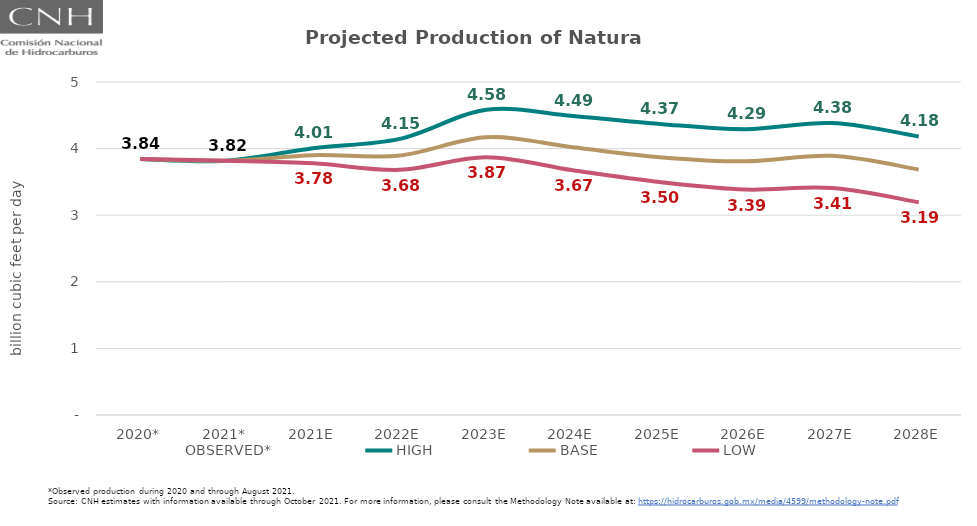
| Category | OBSERVED* | HIGH | BASE | LOW |
|---|---|---|---|---|
| 2020* | 3.843 | 3.843 | 3.843 | 3.843 |
| 2021* | 3.818 | 3.818 | 3.818 | 3.818 |
| 2021E | 4.007 | 4.007 | 3.901 | 3.78 |
| 2022E | 4.146 | 4.146 | 3.897 | 3.681 |
| 2023E | 4.582 | 4.582 | 4.171 | 3.871 |
| 2024E | 4.491 | 4.491 | 4.02 | 3.674 |
| 2025E | 4.371 | 4.371 | 3.872 | 3.499 |
| 2026E | 4.291 | 4.291 | 3.809 | 3.385 |
| 2027E | 4.384 | 4.384 | 3.891 | 3.407 |
| 2028E | 4.183 | 4.183 | 3.687 | 3.195 |